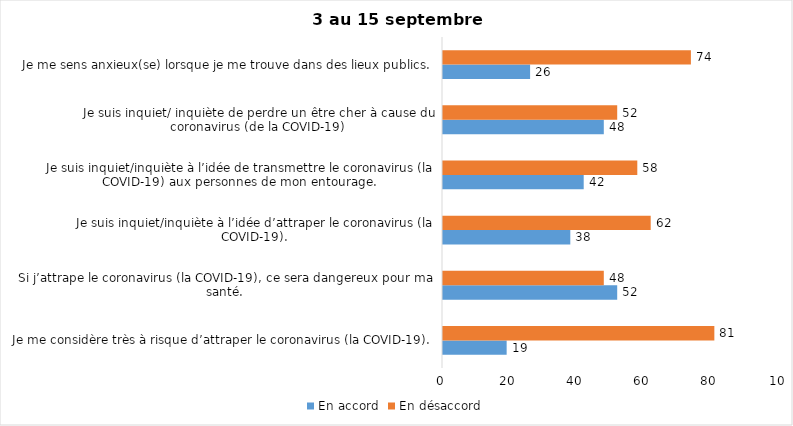
| Category | En accord | En désaccord |
|---|---|---|
| Je me considère très à risque d’attraper le coronavirus (la COVID-19). | 19 | 81 |
| Si j’attrape le coronavirus (la COVID-19), ce sera dangereux pour ma santé. | 52 | 48 |
| Je suis inquiet/inquiète à l’idée d’attraper le coronavirus (la COVID-19). | 38 | 62 |
| Je suis inquiet/inquiète à l’idée de transmettre le coronavirus (la COVID-19) aux personnes de mon entourage. | 42 | 58 |
| Je suis inquiet/ inquiète de perdre un être cher à cause du coronavirus (de la COVID-19) | 48 | 52 |
| Je me sens anxieux(se) lorsque je me trouve dans des lieux publics. | 26 | 74 |